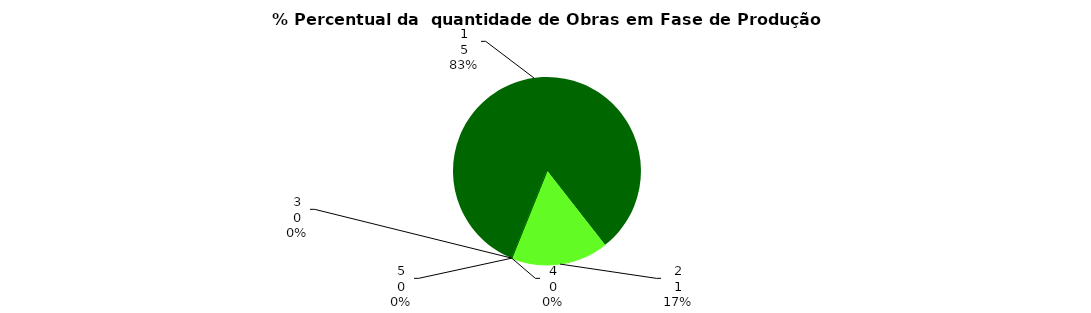
| Category | Series 0 |
|---|---|
| 0 | 5 |
| 1 | 1 |
| 2 | 0 |
| 3 | 0 |
| 4 | 0 |